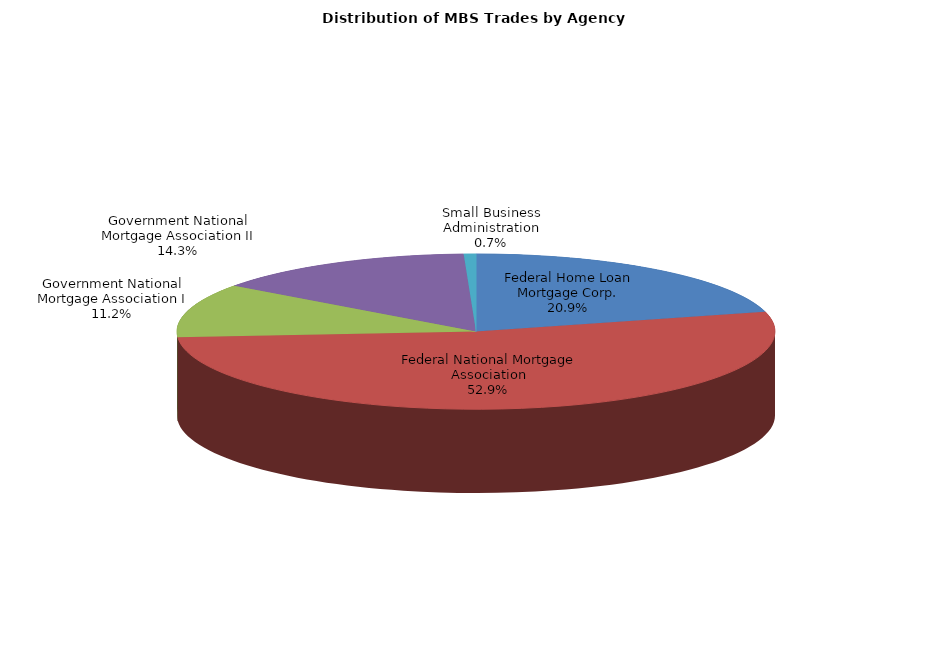
| Category | Series 0 |
|---|---|
| Federal Home Loan Mortgage Corp. | 709.31 |
| Federal National Mortgage Association | 1796.639 |
| Government National Mortgage Association I | 379.663 |
| Government National Mortgage Association II | 485.313 |
| Small Business Administration | 22.333 |